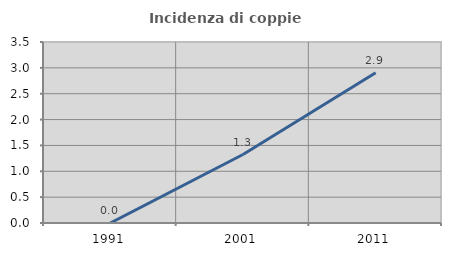
| Category | Incidenza di coppie miste |
|---|---|
| 1991.0 | 0 |
| 2001.0 | 1.325 |
| 2011.0 | 2.907 |